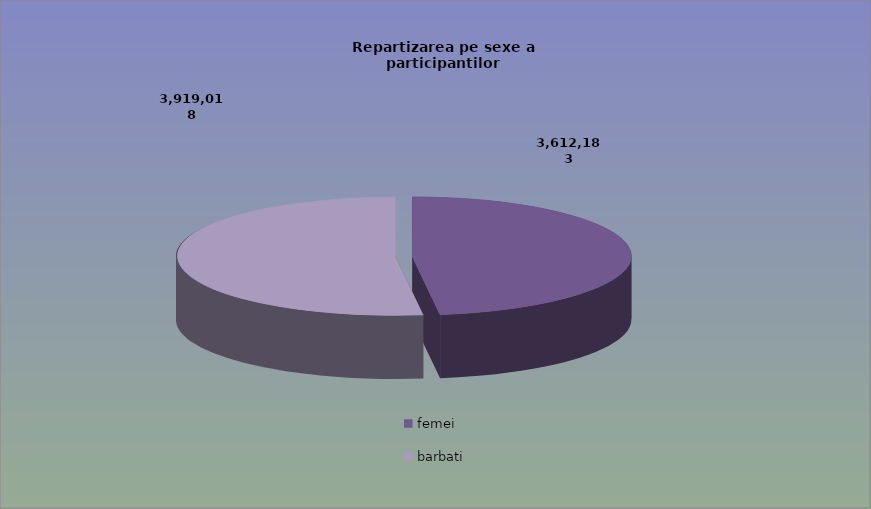
| Category | Series 0 |
|---|---|
| femei | 3612183 |
| barbati | 3919018 |